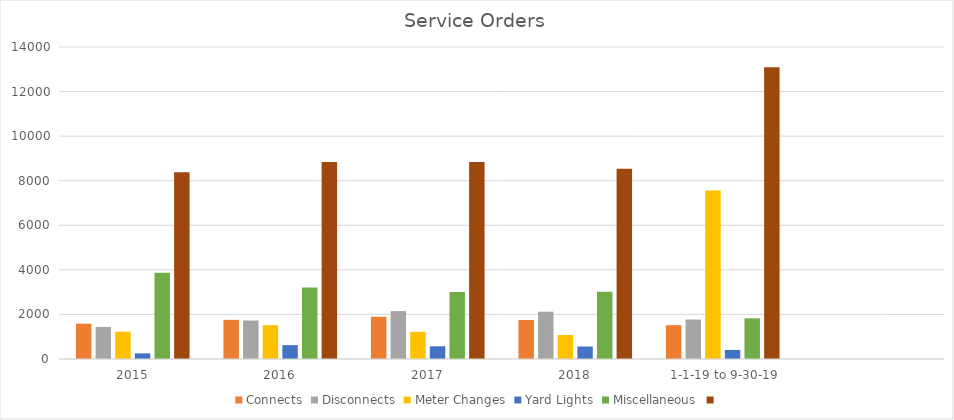
| Category | Connects | Disconnects | Meter Changes | Yard Lights | Miscellaneous | Series 7 |
|---|---|---|---|---|---|---|
| 2015 | 1587 | 1440 | 1228 | 253 | 3874 | 8382 |
| 2016 | 1757 | 1726 | 1516 | 623 | 3213 | 8835 |
| 2017 | 1894 | 2150 | 1219 | 572 | 3002 | 8837 |
| 2018 | 1749 | 2123 | 1079 | 562 | 3023 | 8536 |
|  1-1-19 to 9-30-19 | 1517 | 1772 | 7564 | 408 | 1825 | 13086 |